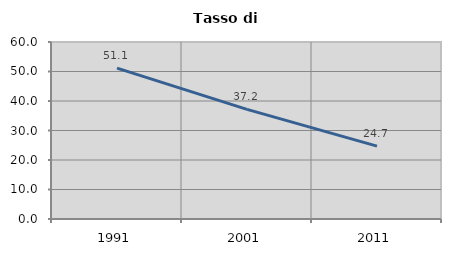
| Category | Tasso di disoccupazione   |
|---|---|
| 1991.0 | 51.137 |
| 2001.0 | 37.159 |
| 2011.0 | 24.687 |